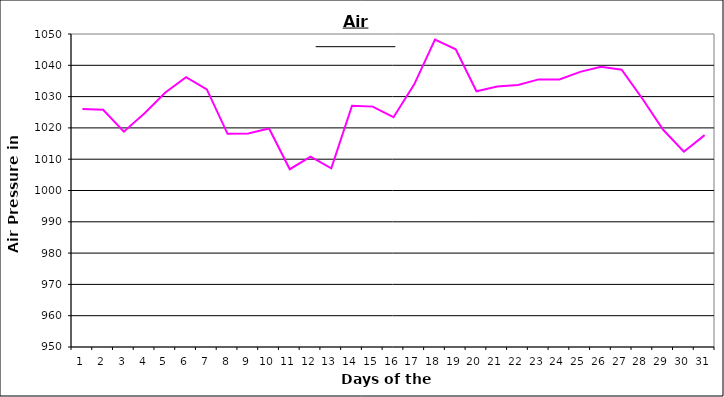
| Category | Series 0 |
|---|---|
| 0 | 1026 |
| 1 | 1025.8 |
| 2 | 1018.8 |
| 3 | 1024.7 |
| 4 | 1031.3 |
| 5 | 1036.2 |
| 6 | 1032.3 |
| 7 | 1018.1 |
| 8 | 1018.2 |
| 9 | 1019.8 |
| 10 | 1006.8 |
| 11 | 1010.8 |
| 12 | 1007.1 |
| 13 | 1027.1 |
| 14 | 1026.8 |
| 15 | 1023.4 |
| 16 | 1033.9 |
| 17 | 1048.2 |
| 18 | 1045.1 |
| 19 | 1031.7 |
| 20 | 1033.2 |
| 21 | 1033.7 |
| 22 | 1035.5 |
| 23 | 1035.5 |
| 24 | 1037.9 |
| 25 | 1039.5 |
| 26 | 1038.6 |
| 27 | 1029.3 |
| 28 | 1019.4 |
| 29 | 1012.4 |
| 30 | 1017.7 |